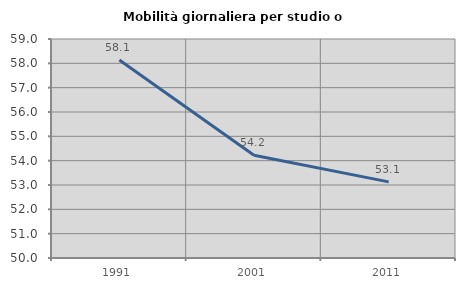
| Category | Mobilità giornaliera per studio o lavoro |
|---|---|
| 1991.0 | 58.134 |
| 2001.0 | 54.222 |
| 2011.0 | 53.128 |